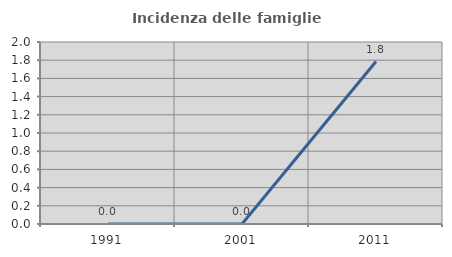
| Category | Incidenza delle famiglie numerose |
|---|---|
| 1991.0 | 0 |
| 2001.0 | 0 |
| 2011.0 | 1.786 |